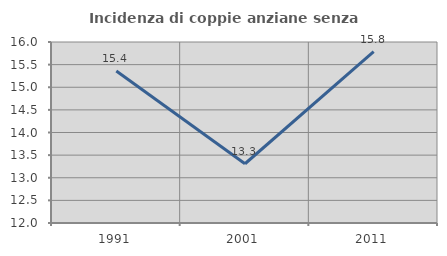
| Category | Incidenza di coppie anziane senza figli  |
|---|---|
| 1991.0 | 15.357 |
| 2001.0 | 13.309 |
| 2011.0 | 15.789 |